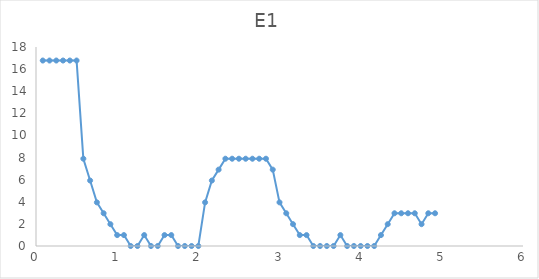
| Category | E1 |
|---|---|
| 0.08333333333333333 | 16.776 |
| 0.16666666666666666 | 16.776 |
| 0.25 | 16.776 |
| 0.3333333333333333 | 16.776 |
| 0.4166666666666667 | 16.776 |
| 0.5 | 16.776 |
| 0.5833333333333334 | 7.895 |
| 0.6666666666666666 | 5.921 |
| 0.75 | 3.947 |
| 0.8333333333333334 | 2.961 |
| 0.9166666666666666 | 1.974 |
| 1.0 | 0.987 |
| 1.0833333333333333 | 0.987 |
| 1.1666666666666667 | 0 |
| 1.25 | 0 |
| 1.3333333333333333 | 0.987 |
| 1.4166666666666667 | 0 |
| 1.5 | 0 |
| 1.5833333333333333 | 0.987 |
| 1.6666666666666667 | 0.987 |
| 1.75 | 0 |
| 1.8333333333333333 | 0 |
| 1.9166666666666667 | 0 |
| 2.0 | 0 |
| 2.0833333333333335 | 3.947 |
| 2.1666666666666665 | 5.921 |
| 2.25 | 6.908 |
| 2.3333333333333335 | 7.895 |
| 2.4166666666666665 | 7.895 |
| 2.5 | 7.895 |
| 2.5833333333333335 | 7.895 |
| 2.6666666666666665 | 7.895 |
| 2.75 | 7.895 |
| 2.8333333333333335 | 7.895 |
| 2.9166666666666665 | 6.908 |
| 3.0 | 3.947 |
| 3.0833333333333335 | 2.961 |
| 3.1666666666666665 | 1.974 |
| 3.25 | 0.987 |
| 3.3333333333333335 | 0.987 |
| 3.4166666666666665 | 0 |
| 3.5 | 0 |
| 3.5833333333333335 | 0 |
| 3.6666666666666665 | 0 |
| 3.75 | 0.987 |
| 3.8333333333333335 | 0 |
| 3.9166666666666665 | 0 |
| 4.0 | 0 |
| 4.083333333333333 | 0 |
| 4.166666666666667 | 0 |
| 4.25 | 0.987 |
| 4.333333333333333 | 1.974 |
| 4.416666666666667 | 2.961 |
| 4.5 | 2.961 |
| 4.583333333333333 | 2.961 |
| 4.666666666666667 | 2.961 |
| 4.75 | 1.974 |
| 4.833333333333333 | 2.961 |
| 4.916666666666667 | 2.961 |